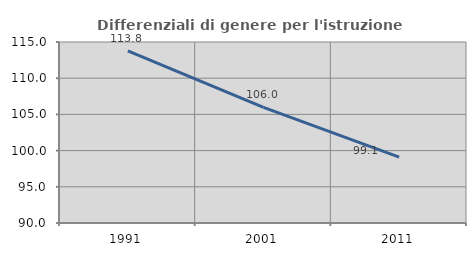
| Category | Differenziali di genere per l'istruzione superiore |
|---|---|
| 1991.0 | 113.774 |
| 2001.0 | 105.972 |
| 2011.0 | 99.097 |